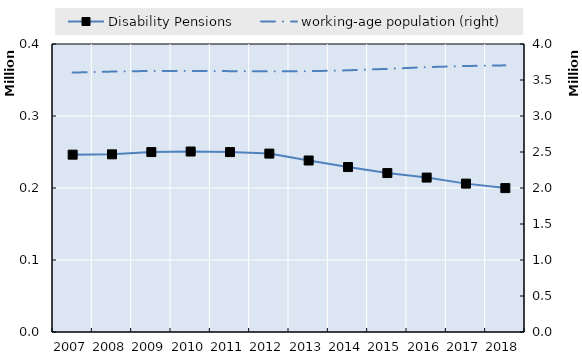
| Category | Disability Pensions | 0 | Series 14 | Series 15 | Series 16 | Series 17 | Series 18 | Series 19 |
|---|---|---|---|---|---|---|---|---|
| 2007.0 | 246290 |  |  |  |  |  |  |  |
| 2008.0 | 246753 |  |  |  |  |  |  |  |
| 2009.0 | 249907 |  |  |  |  |  |  |  |
| 2010.0 | 250664 |  |  |  |  |  |  |  |
| 2011.0 | 249885 |  |  |  |  |  |  |  |
| 2012.0 | 247772 |  |  |  |  |  |  |  |
| 2013.0 | 238212 |  |  |  |  |  |  |  |
| 2014.0 | 229110 |  |  |  |  |  |  |  |
| 2015.0 | 220740 |  |  |  |  |  |  |  |
| 2016.0 | 214489 |  |  |  |  |  |  |  |
| 2017.0 | 206077 |  |  |  |  |  |  |  |
| 2018.0 | 199850 |  |  |  |  |  |  |  |